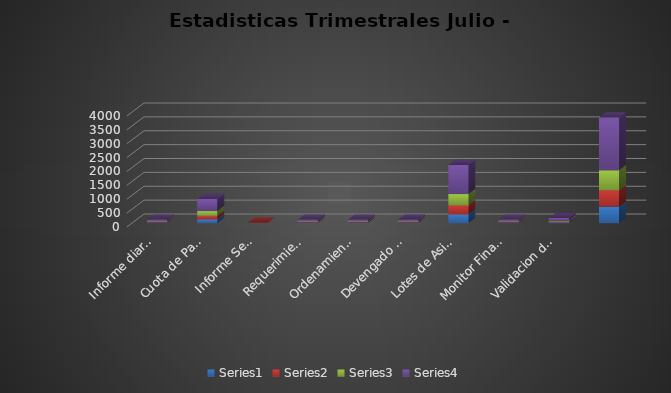
| Category | Series 0 | Series 1 | Series 2 | Series 3 |
|---|---|---|---|---|
| Informe diario de la programacion de caja | 21 | 21 | 21 | 63 |
| Cuota de Pago Pendiente de Asignar | 136 | 123 | 175 | 434 |
| Informe Semanal de Situación Financiera del Tesoro  | 5 | 5 | 5 | 15 |
| Requerimiento de Caja Diario  | 21 | 21 | 21 | 63 |
| Ordenamiento por tesorero pagador  | 21 | 21 | 21 | 63 |
| Devengado no pagado  | 21 | 21 | 21 | 63 |
| Lotes de Asignaciones de Cuota de Pago  | 313 | 329 | 405 | 1047 |
| Monitor Financiero Diario | 21 | 21 | 21 | 63 |
| Validacion de Programacion para Transferencia de Recursos  | 32 | 31 | 30 | 93 |
|  | 591 | 593 | 720 | 1904 |